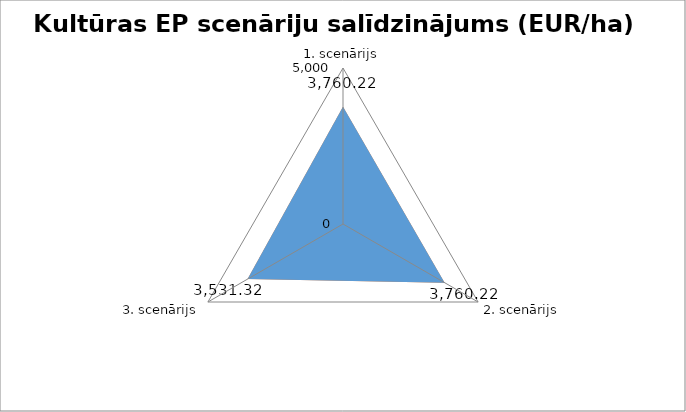
| Category | Series 1 | Series 0 |
|---|---|---|
| 1. scenārijs | 3760.216 | 3760.216 |
| 2. scenārijs | 3760.216 | 3760.216 |
| 3. scenārijs | 3531.316 | 3531.316 |